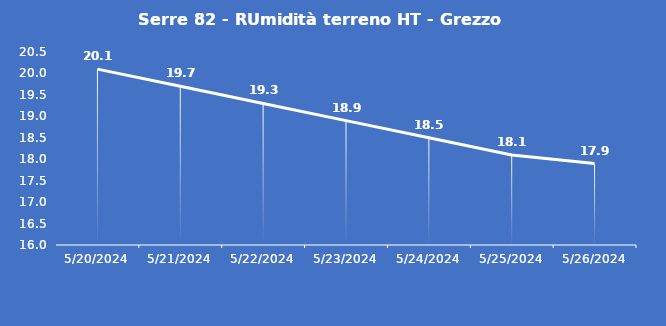
| Category | Serre 82 - RUmidità terreno HT - Grezzo (%VWC) |
|---|---|
| 5/20/24 | 20.1 |
| 5/21/24 | 19.7 |
| 5/22/24 | 19.3 |
| 5/23/24 | 18.9 |
| 5/24/24 | 18.5 |
| 5/25/24 | 18.1 |
| 5/26/24 | 17.9 |